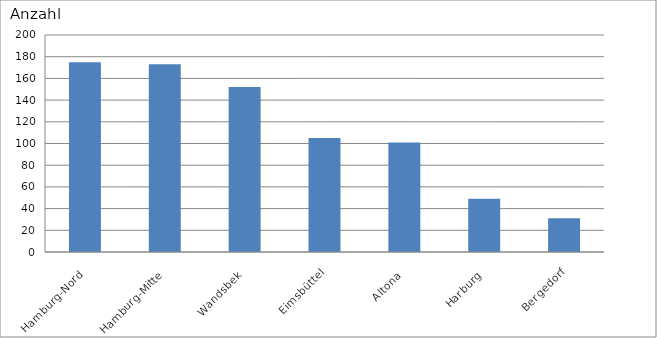
| Category | Hamburg-Nord Hamburg-Mitte Wandsbek Eimsbüttel Altona Harburg Bergedorf |
|---|---|
| Hamburg-Nord | 175 |
| Hamburg-Mitte | 173 |
| Wandsbek | 152 |
| Eimsbüttel | 105 |
| Altona | 101 |
| Harburg | 49 |
| Bergedorf | 31 |